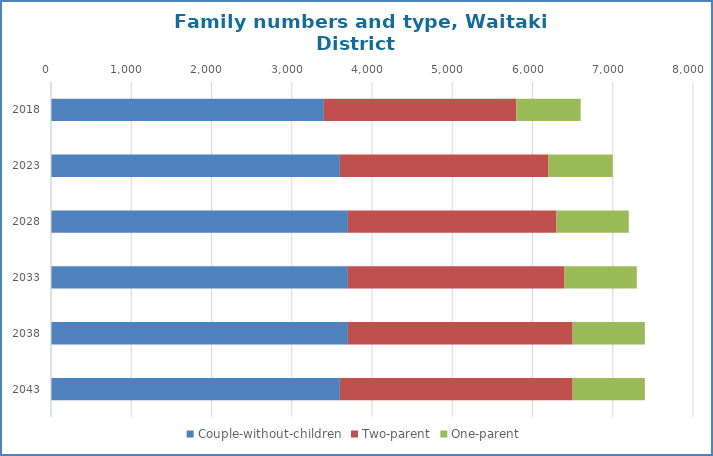
| Category | Couple-without-children | Two-parent | One-parent |
|---|---|---|---|
| 2018.0 | 3400 | 2400 | 800 |
| 2023.0 | 3600 | 2600 | 800 |
| 2028.0 | 3700 | 2600 | 900 |
| 2033.0 | 3700 | 2700 | 900 |
| 2038.0 | 3700 | 2800 | 900 |
| 2043.0 | 3600 | 2900 | 900 |